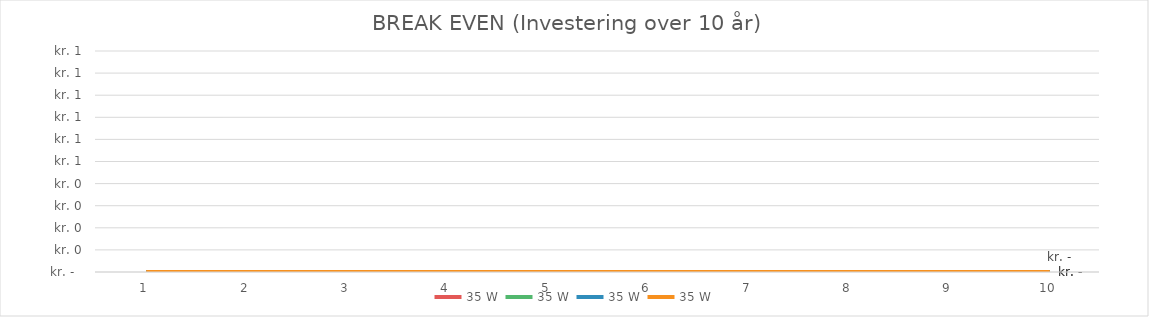
| Category | 35 W |
|---|---|
| 1.0 | 0 |
| 2.0 | 0 |
| 3.0 | 0 |
| 4.0 | 0 |
| 5.0 | 0 |
| 6.0 | 0 |
| 7.0 | 0 |
| 8.0 | 0 |
| 9.0 | 0 |
| 10.0 | 0 |